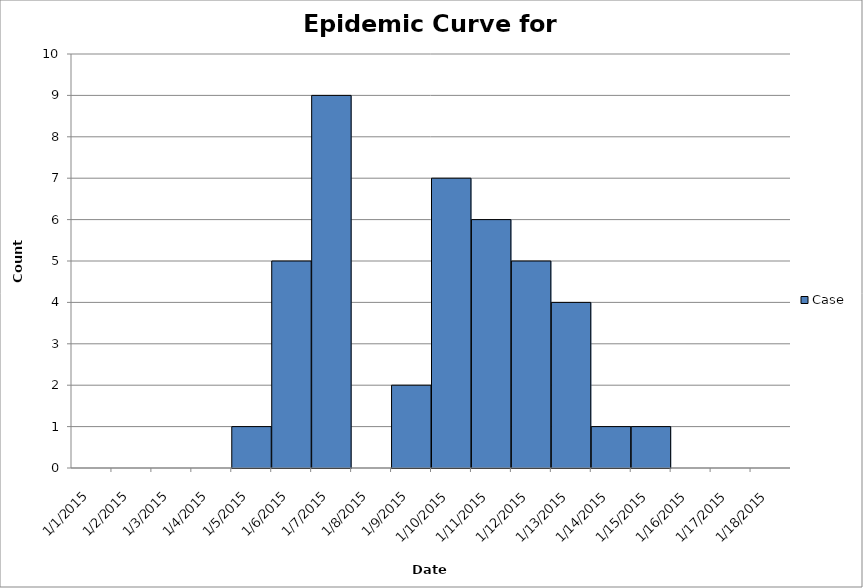
| Category | Case |
|---|---|
| 1/1/15 | 0 |
| 1/2/15 | 0 |
| 1/3/15 | 0 |
| 1/4/15 | 0 |
| 1/5/15 | 1 |
| 1/6/15 | 5 |
| 1/7/15 | 9 |
| 1/8/15 | 0 |
| 1/9/15 | 2 |
| 1/10/15 | 7 |
| 1/11/15 | 6 |
| 1/12/15 | 5 |
| 1/13/15 | 4 |
| 1/14/15 | 1 |
| 1/15/15 | 1 |
| 1/16/15 | 0 |
| 1/17/15 | 0 |
| 1/18/15 | 0 |